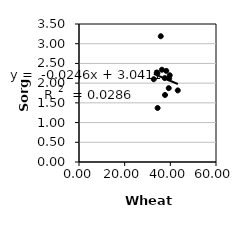
| Category | Series 0 |
|---|---|
| 34.42797621988373 | 1.37 |
| 37.674233622307625 | 1.7 |
| 34.07033276931754 | 2.27 |
| 32.74831966554108 | 2.1 |
| 39.49809468822171 | 2.12 |
| 34.33337954699063 | 2.251 |
| 39.30463185736365 | 1.873 |
| 38.21342007909172 | 2.31 |
| 37.57456694188117 | 2.128 |
| 35.812470260070555 | 3.19 |
| 36.31403054332798 | 2.34 |
| 39.740031772496344 | 2.2 |
| 43.2652760860739 | 1.815 |